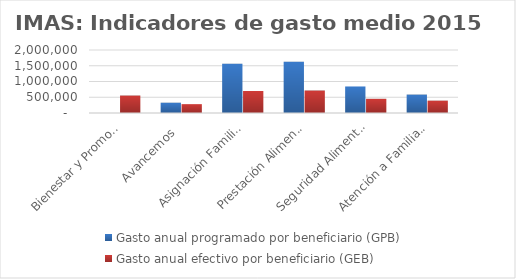
| Category | Gasto anual programado por beneficiario (GPB)  | Gasto anual efectivo por beneficiario (GEB)  |
|---|---|---|
| Bienestar y Promocion Familiar | 0 | 553975.17 |
| Avancemos | 326767.914 | 280985.002 |
| Asignación Familiar | 1566024.475 | 698163.324 |
| Prestación Alimentaria | 1630898.876 | 713684.211 |
| Seguridad Alimentaria | 842271.152 | 451164.466 |
| Atención a Familias | 584268.957 | 392240.413 |